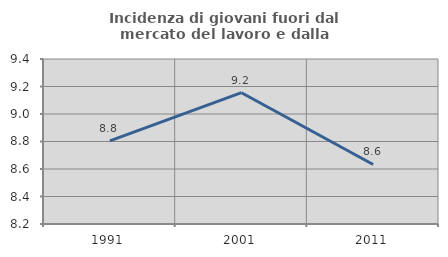
| Category | Incidenza di giovani fuori dal mercato del lavoro e dalla formazione  |
|---|---|
| 1991.0 | 8.805 |
| 2001.0 | 9.155 |
| 2011.0 | 8.633 |